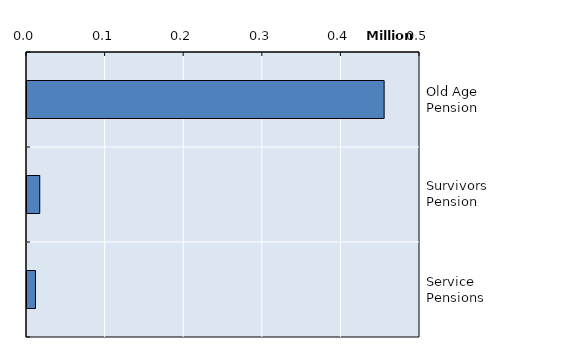
| Category | Series 0 |
|---|---|
| Old Age Pension | 454370 |
| Survivors Pension | 16202 |
| Service  Pensions | 10766 |